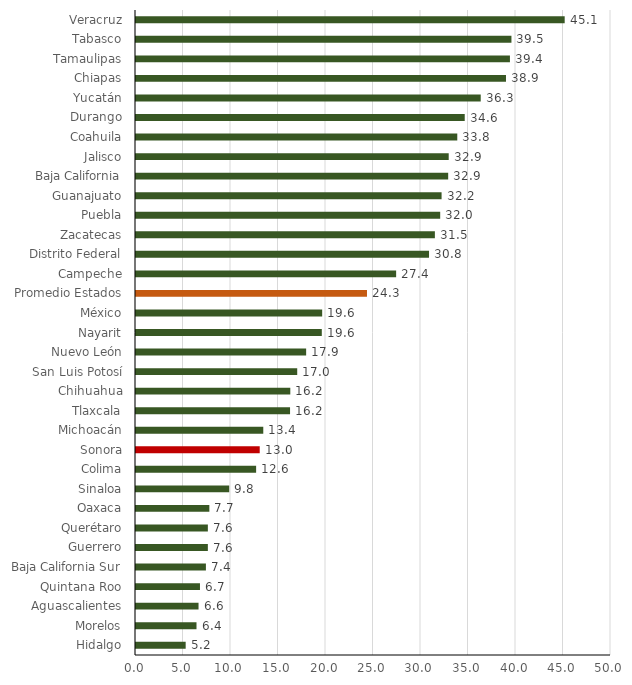
| Category | Proporción Gasto Serv Pers del Total |
|---|---|
| Hidalgo | 5.229 |
| Morelos | 6.369 |
| Aguascalientes | 6.583 |
| Quintana Roo | 6.734 |
| Baja California Sur | 7.359 |
| Guerrero | 7.564 |
| Querétaro | 7.564 |
| Oaxaca | 7.722 |
| Sinaloa | 9.811 |
| Colima | 12.645 |
| Sonora | 13.024 |
| Michoacán | 13.398 |
| Tlaxcala | 16.216 |
| Chihuahua | 16.242 |
| San Luis Potosí | 16.97 |
| Nuevo León | 17.91 |
| Nayarit | 19.558 |
| México | 19.598 |
| Promedio Estados | 24.315 |
| Campeche | 27.383 |
| Distrito Federal | 30.845 |
| Zacatecas | 31.461 |
| Puebla | 32.021 |
| Guanajuato | 32.167 |
| Baja California | 32.862 |
| Jalisco | 32.917 |
| Coahuila | 33.819 |
| Durango | 34.603 |
| Yucatán | 36.287 |
| Chiapas | 38.946 |
| Tamaulipas | 39.361 |
| Tabasco | 39.52 |
| Veracruz | 45.125 |